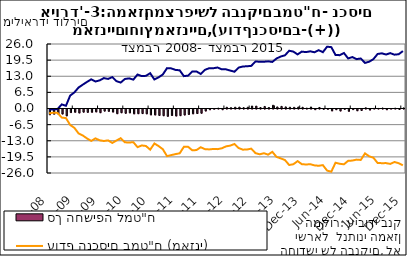
| Category | סך החשיפה למט"ח |
|---|---|
| 2008-12-31 | -2290.089 |
| 2009-01-31 | -2061.957 |
| 2009-02-28 | -2001.624 |
| 2009-03-31 | -2010.48 |
| 2009-04-30 | -2762.979 |
| 2009-05-31 | -1431.598 |
| 2009-06-30 | -1304.951 |
| 2009-07-31 | -1589.024 |
| 2009-08-31 | -1262.268 |
| 2009-09-30 | -1353.917 |
| 2009-10-31 | -1305.964 |
| 2009-11-30 | -1161.337 |
| 2009-12-31 | -1487.724 |
| 2010-01-31 | -845.705 |
| 2010-02-28 | -934.783 |
| 2010-03-31 | -1223.161 |
| 2010-04-30 | -1886.418 |
| 2010-05-31 | -1502.469 |
| 2010-06-30 | -1729.017 |
| 2010-07-31 | -1559.978 |
| 2010-08-31 | -1941.415 |
| 2010-09-30 | -1885.375 |
| 2010-10-31 | -1835.341 |
| 2010-11-30 | -1944.744 |
| 2010-12-31 | -2359.737 |
| 2011-01-31 | -2398.604 |
| 2011-02-28 | -2583.578 |
| 2011-03-31 | -2697.833 |
| 2011-04-30 | -2939.62 |
| 2011-05-31 | -2620.726 |
| 2011-06-30 | -2811.69 |
| 2011-07-31 | -2671.489 |
| 2011-08-31 | -2408.079 |
| 2011-09-30 | -2178.928 |
| 2011-10-31 | -1928.589 |
| 2011-11-30 | -1821.935 |
| 2011-12-31 | -1694.898 |
| 2012-01-31 | -796.437 |
| 2012-02-29 | -256.469 |
| 2012-03-31 | -73.373 |
| 2012-04-30 | 140.184 |
| 2012-05-31 | -267.079 |
| 2012-06-30 | 498.302 |
| 2012-07-31 | 334.299 |
| 2012-08-31 | 510.84 |
| 2012-09-30 | 554.351 |
| 2012-10-31 | 340 |
| 2012-11-30 | 506.957 |
| 2012-12-31 | 994.074 |
| 2013-01-31 | 956.933 |
| 2013-02-28 | 379.146 |
| 2013-03-31 | 819.988 |
| 2013-04-30 | 406.005 |
| 2013-05-31 | 1300.545 |
| 2013-06-30 | 629.93 |
| 2013-07-31 | 853.837 |
| 2013-08-31 | 651.609 |
| 2013-09-30 | 517.451 |
| 2013-10-31 | 466.936 |
| 2013-11-30 | 594.548 |
| 2013-12-31 | 489.988 |
| 2014-01-31 | 158.265 |
| 2014-02-28 | 605.044 |
| 2014-03-31 | -257.409 |
| 2014-04-30 | 419.659 |
| 2014-05-31 | -126.158 |
| 2014-06-30 | -113.836 |
| 2014-07-31 | -737.3 |
| 2014-08-31 | -264.795 |
| 2014-09-30 | -788.459 |
| 2014-10-31 | -130.3 |
| 2014-11-30 | -915.222 |
| 2014-12-31 | -237.883 |
| 2015-01-31 | -695.943 |
| 2015-02-28 | -585.164 |
| 2015-03-31 | 275.166 |
| 2015-04-30 | -409.059 |
| 2015-05-31 | 44.032 |
| 2015-06-30 | 24.257 |
| 2015-07-31 | 204.521 |
| 2015-08-31 | -254.069 |
| 2015-09-30 | -19.667 |
| 2015-10-31 | 128.858 |
| 2015-11-30 | -171.028 |
| 2015-12-31 | 249.457 |